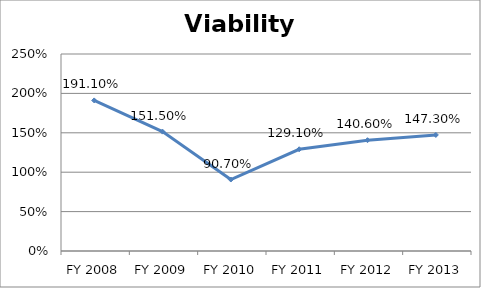
| Category | Viability ratio |
|---|---|
| FY 2013 | 1.473 |
| FY 2012 | 1.406 |
| FY 2011 | 1.291 |
| FY 2010 | 0.907 |
| FY 2009 | 1.515 |
| FY 2008 | 1.911 |